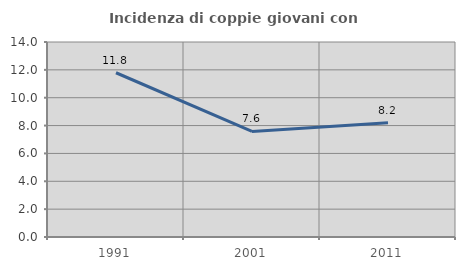
| Category | Incidenza di coppie giovani con figli |
|---|---|
| 1991.0 | 11.792 |
| 2001.0 | 7.576 |
| 2011.0 | 8.197 |